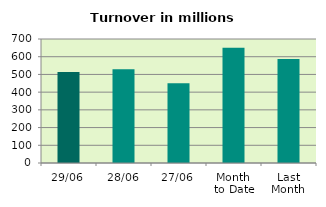
| Category | Series 0 |
|---|---|
| 29/06 | 513.268 |
| 28/06 | 529.909 |
| 27/06 | 450.249 |
| Month 
to Date | 650.478 |
| Last
Month | 587.249 |